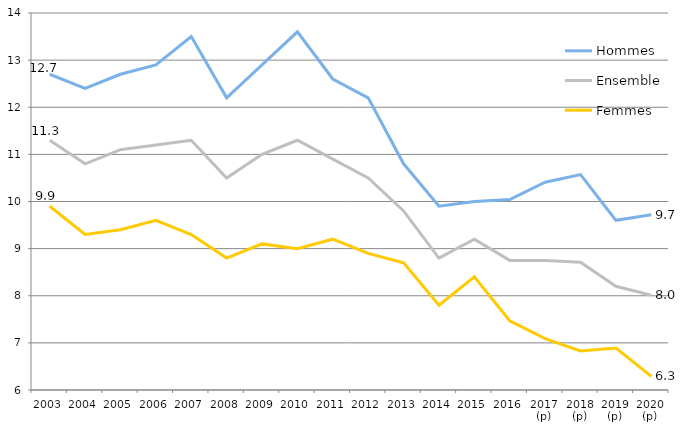
| Category | Hommes | Ensemble | Femmes |
|---|---|---|---|
| 2003 | 12.7 | 11.3 | 9.9 |
| 2004 | 12.4 | 10.8 | 9.3 |
| 2005 | 12.7 | 11.1 | 9.4 |
| 2006 | 12.9 | 11.2 | 9.6 |
| 2007 | 13.5 | 11.3 | 9.3 |
| 2008 | 12.2 | 10.5 | 8.8 |
| 2009 | 12.9 | 11 | 9.1 |
| 2010 | 13.6 | 11.3 | 9 |
| 2011 | 12.6 | 10.9 | 9.2 |
| 2012 | 12.2 | 10.5 | 8.9 |
| 2013 | 10.8 | 9.8 | 8.7 |
| 2014 | 9.9 | 8.8 | 7.8 |
| 2015 | 10 | 9.2 | 8.4 |
| 2016 | 10.04 | 8.75 | 7.47 |
| 2017 (p) | 10.41 | 8.75 | 7.09 |
| 2018 (p) | 10.57 | 8.71 | 6.83 |
| 2019 (p) | 9.6 | 8.2 | 6.89 |
| 2020 (p) | 9.72 | 8.01 | 6.29 |